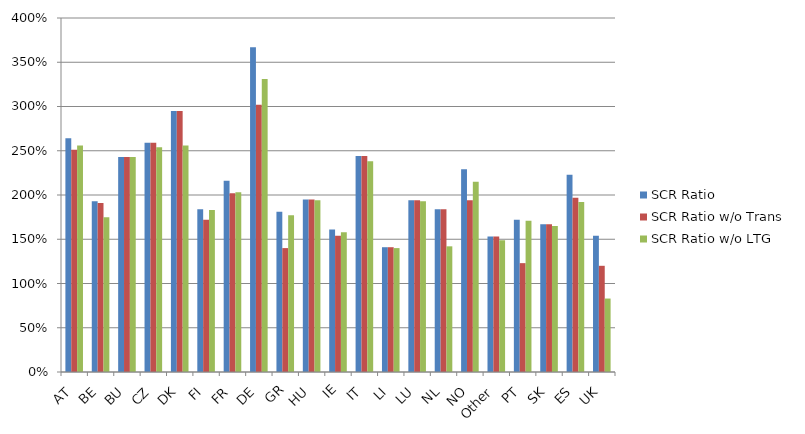
| Category | SCR Ratio | SCR Ratio w/o Trans | SCR Ratio w/o LTG |
|---|---|---|---|
| AT | 2.64 | 2.51 | 2.56 |
| BE | 1.93 | 1.91 | 1.75 |
| BU | 2.43 | 2.43 | 2.43 |
| CZ | 2.59 | 2.59 | 2.54 |
| DK | 2.95 | 2.95 | 2.56 |
| FI | 1.84 | 1.72 | 1.83 |
| FR | 2.16 | 2.02 | 2.03 |
| DE | 3.67 | 3.02 | 3.31 |
| GR | 1.81 | 1.4 | 1.77 |
| HU | 1.95 | 1.95 | 1.94 |
| IE | 1.61 | 1.54 | 1.58 |
| IT | 2.44 | 2.44 | 2.38 |
| LI | 1.41 | 1.41 | 1.4 |
| LU | 1.94 | 1.94 | 1.93 |
| NL | 1.84 | 1.84 | 1.42 |
| NO | 2.29 | 1.94 | 2.15 |
| Other | 1.53 | 1.53 | 1.49 |
| PT | 1.72 | 1.23 | 1.71 |
| SK | 1.67 | 1.67 | 1.65 |
| ES | 2.23 | 1.97 | 1.92 |
| UK | 1.54 | 1.2 | 0.83 |